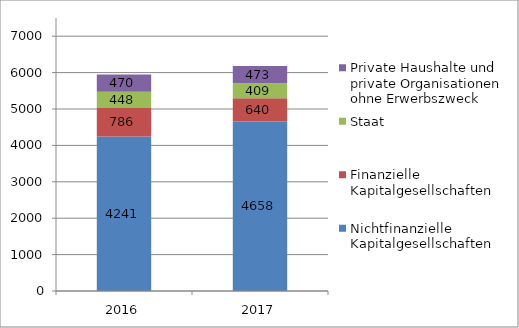
| Category | Nichtfinanzielle Kapitalgesellschaften | Finanzielle Kapitalgesellschaften | Staat | Private Haushalte und private Organisationen ohne Erwerbszweck |
|---|---|---|---|---|
| 2016.0 | 4241.3 | 786.3 | 447.8 | 469.8 |
| 2017.0 | 4658.3 | 640.3 | 408.7 | 472.7 |